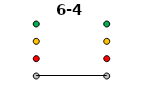
| Category | 0 | 1 | 2 | 3 | 6-4 |
|---|---|---|---|---|---|
| Time 1 | 0 | 1 | 2 | 3 | 0 |
| Time 2 | 0 | 1 | 2 | 3 | 0 |